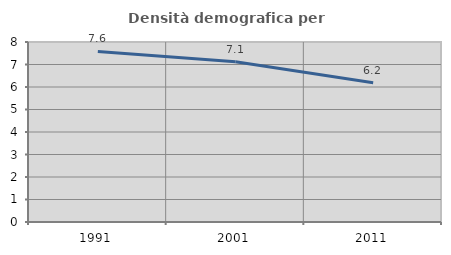
| Category | Densità demografica |
|---|---|
| 1991.0 | 7.583 |
| 2001.0 | 7.119 |
| 2011.0 | 6.193 |